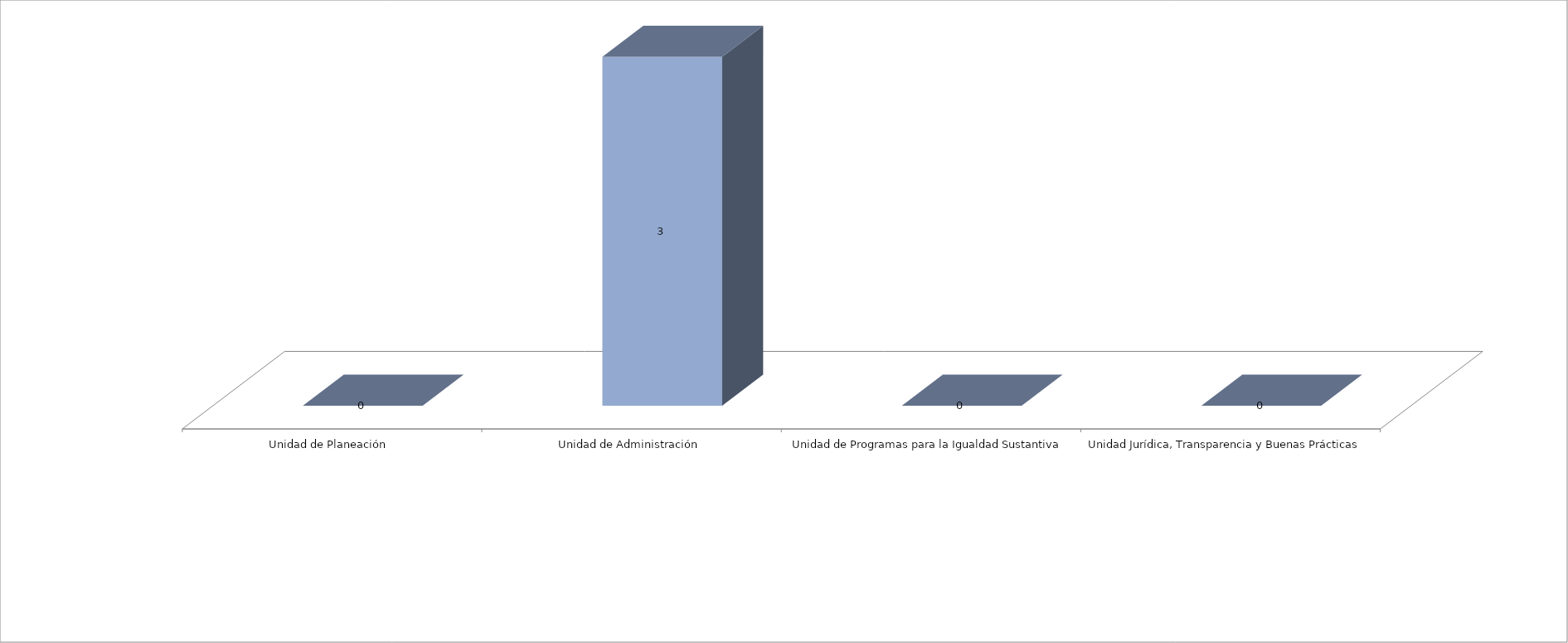
| Category | Series 0 | Series 1 |
|---|---|---|
| Unidad de Planeación  |  | 0 |
| Unidad de Administración |  | 3 |
| Unidad de Programas para la Igualdad Sustantiva |  | 0 |
| Unidad Jurídica, Transparencia y Buenas Prácticas  |  | 0 |